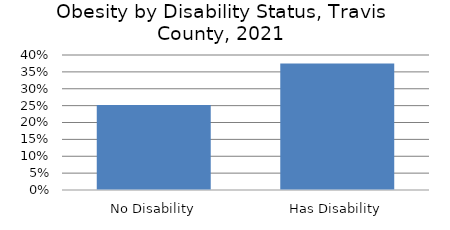
| Category | Series 0 |
|---|---|
| No Disability | 0.252 |
| Has Disability | 0.375 |